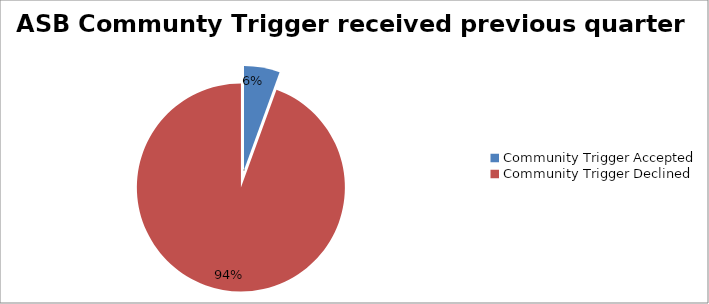
| Category | Series 0 |
|---|---|
| Community Trigger Accepted | 1 |
| Community Trigger Declined | 17 |